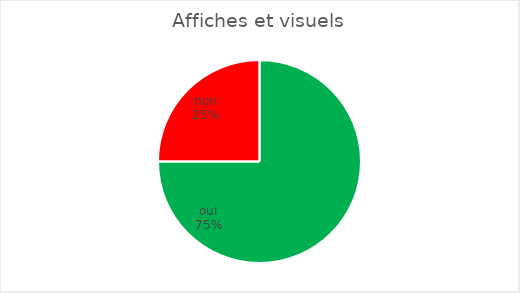
| Category | Affiches et visuels disponibles aux endroits stratégiques |
|---|---|
| oui | 9 |
| non | 3 |